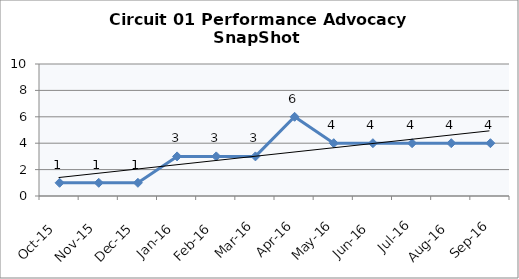
| Category | Circuit 01 |
|---|---|
| Oct-15 | 1 |
| Nov-15 | 1 |
| Dec-15 | 1 |
| Jan-16 | 3 |
| Feb-16 | 3 |
| Mar-16 | 3 |
| Apr-16 | 6 |
| May-16 | 4 |
| Jun-16 | 4 |
| Jul-16 | 4 |
| Aug-16 | 4 |
| Sep-16 | 4 |